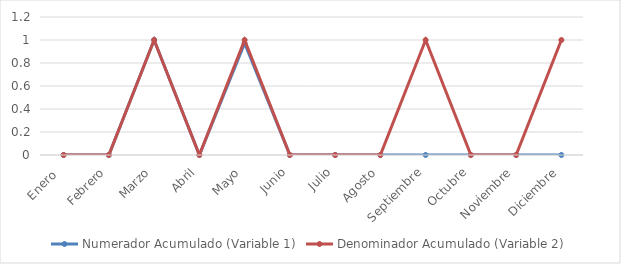
| Category | Numerador Acumulado (Variable 1) | Denominador Acumulado (Variable 2) |
|---|---|---|
| Enero  | 0 | 0 |
| Febrero | 0 | 0 |
| Marzo | 1 | 1 |
| Abril | 0 | 0 |
| Mayo | 0.972 | 1 |
| Junio | 0 | 0 |
| Julio | 0 | 0 |
| Agosto | 0 | 0 |
| Septiembre | 0 | 1 |
| Octubre | 0 | 0 |
| Noviembre | 0 | 0 |
| Diciembre | 0 | 1 |